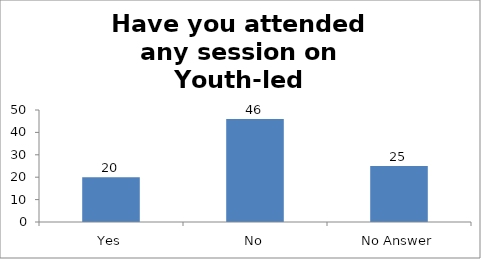
| Category | Have you attended any session on Youth-led Changemaking before? |
|---|---|
| Yes | 20 |
| No | 46 |
| No Answer | 25 |